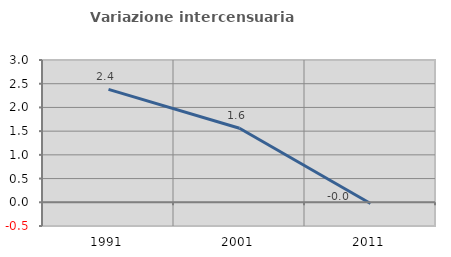
| Category | Variazione intercensuaria annua |
|---|---|
| 1991.0 | 2.38 |
| 2001.0 | 1.56 |
| 2011.0 | -0.025 |